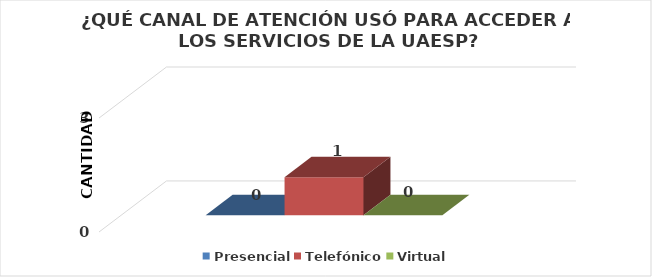
| Category | Presencial | Telefónico | Virtual |
|---|---|---|---|
| 0 | 0 | 1 | 0 |